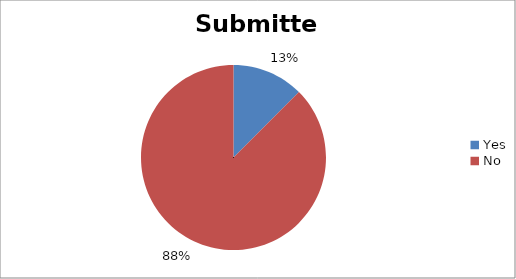
| Category | Submitted |
|---|---|
| Yes | 1 |
| No | 7 |